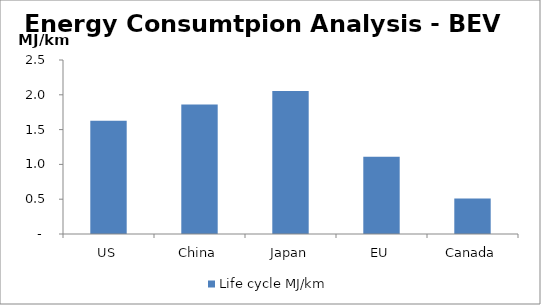
| Category | Life cycle |
|---|---|
| US | 1.629 |
| China | 1.861 |
| Japan | 2.055 |
| EU | 1.108 |
| Canada | 0.509 |